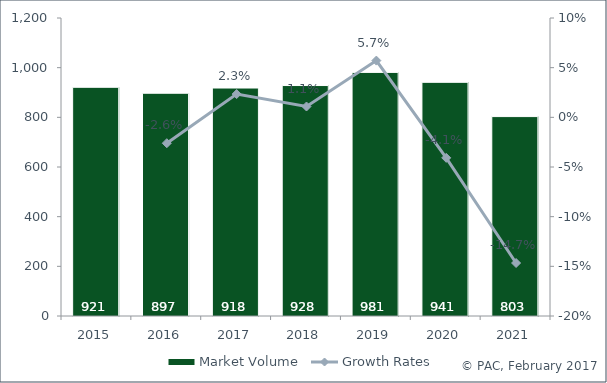
| Category | Market Volume |
|---|---|
| 2015.0 | 921 |
| 2016.0 | 897 |
| 2017.0 | 918 |
| 2018.0 | 928 |
| 2019.0 | 981 |
| 2020.0 | 941 |
| 2021.0 | 803 |